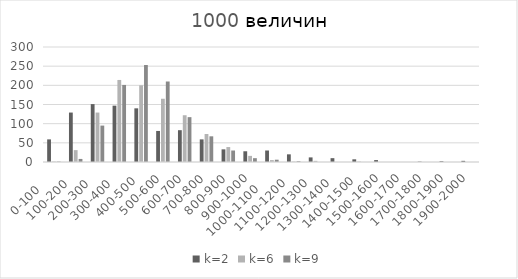
| Category | k=2 | k=6 | k=9 |
|---|---|---|---|
| 0-100     | 59 | 1 | 1 |
| 100-200   | 129 | 31 | 8 |
| 200-300   | 151 | 129 | 95 |
| 300-400   | 147 | 214 | 201 |
| 400-500  | 140 | 200 | 253 |
| 500-600 | 81 | 165 | 210 |
| 600-700 | 83 | 122 | 117 |
| 700-800 | 59 | 73 | 67 |
| 800-900 | 33 | 39 | 30 |
| 900-1000 | 28 | 16 | 10 |
| 1000-1100     | 30 | 5 | 6 |
| 1100-1200   | 20 | 1 | 2 |
| 1200-1300   | 12 | 3 | 0 |
| 1300-1400   | 10 | 0 | 0 |
| 1400-1500  | 7 | 1 | 0 |
| 1500-1600 | 5 | 0 | 0 |
| 1600-1700 | 0 | 0 | 0 |
| 1700-1800 | 1 | 0 | 0 |
| 1800-1900 | 2 | 0 | 0 |
| 1900-2000 | 3 | 0 | 0 |